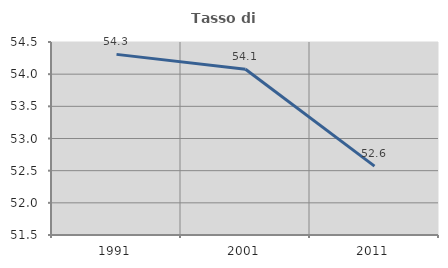
| Category | Tasso di occupazione   |
|---|---|
| 1991.0 | 54.308 |
| 2001.0 | 54.077 |
| 2011.0 | 52.57 |